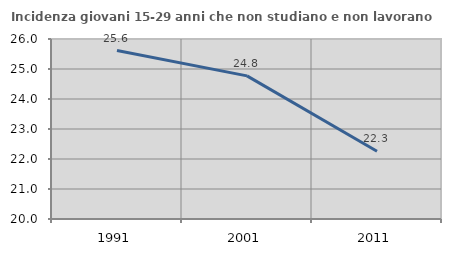
| Category | Incidenza giovani 15-29 anni che non studiano e non lavorano  |
|---|---|
| 1991.0 | 25.616 |
| 2001.0 | 24.77 |
| 2011.0 | 22.257 |